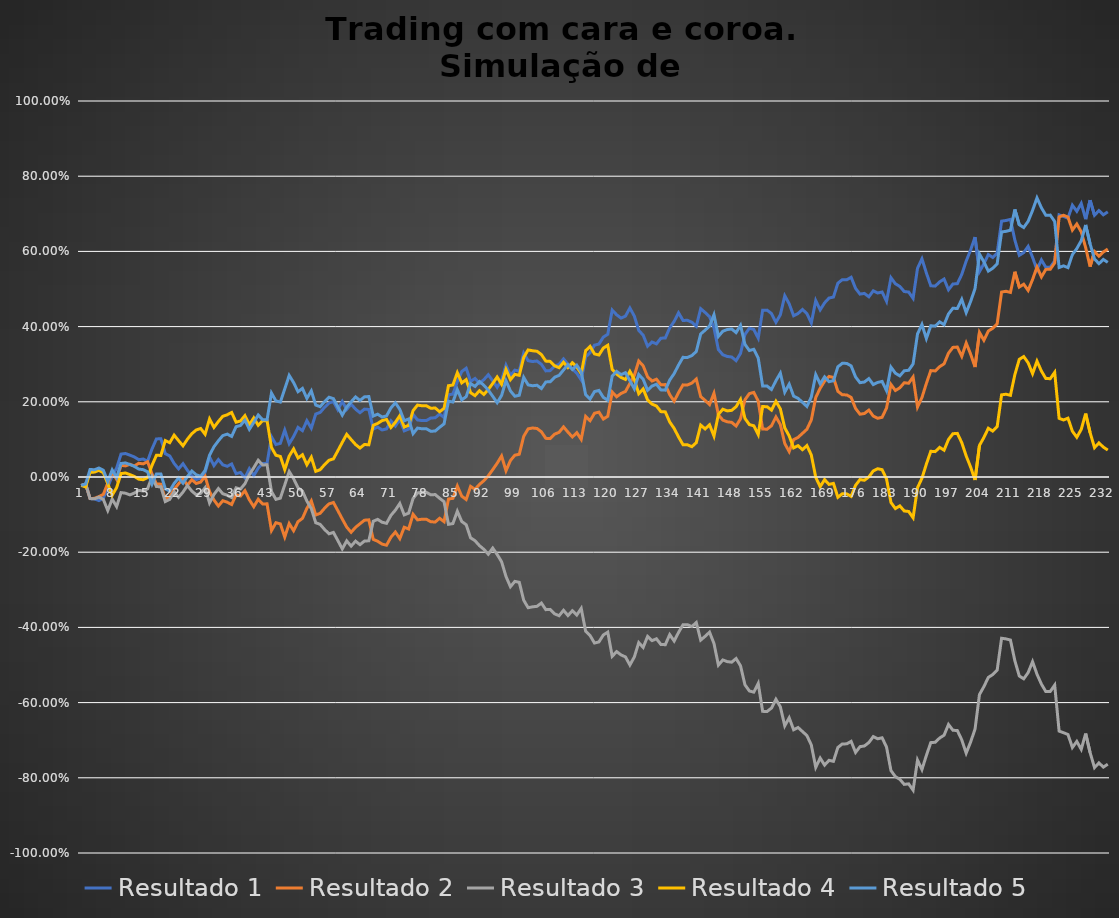
| Category | Resultado 1 | Resultado 2 | Resultado 3 | Resultado 4 | Resultado 5 |
|---|---|---|---|---|---|
| 0 | -0.022 | -0.022 | -0.022 | -0.022 | -0.022 |
| 1 | -0.019 | -0.019 | -0.019 | -0.026 | -0.019 |
| 2 | -0.057 | -0.057 | -0.057 | 0.012 | 0.02 |
| 3 | -0.058 | -0.057 | -0.058 | 0.013 | 0.019 |
| 4 | -0.063 | -0.052 | -0.053 | 0.018 | 0.024 |
| 5 | -0.057 | -0.046 | -0.059 | 0.012 | 0.018 |
| 6 | -0.027 | -0.016 | -0.089 | -0.018 | -0.012 |
| 7 | 0.003 | 0.014 | -0.059 | -0.048 | 0.019 |
| 8 | 0.024 | -0.006 | -0.079 | -0.028 | -0.001 |
| 9 | 0.061 | 0.031 | -0.041 | 0.009 | 0.036 |
| 10 | 0.063 | 0.03 | -0.043 | 0.011 | 0.038 |
| 11 | 0.058 | 0.034 | -0.047 | 0.006 | 0.033 |
| 12 | 0.053 | 0.029 | -0.043 | 0.002 | 0.028 |
| 13 | 0.046 | 0.037 | -0.035 | -0.006 | 0.021 |
| 14 | 0.048 | 0.035 | -0.037 | -0.007 | 0.019 |
| 15 | 0.042 | 0.041 | -0.031 | -0.002 | 0.014 |
| 16 | 0.075 | 0.008 | 0.001 | 0.031 | -0.019 |
| 17 | 0.101 | -0.019 | -0.025 | 0.058 | 0.008 |
| 18 | 0.102 | -0.019 | -0.026 | 0.057 | 0.008 |
| 19 | 0.062 | -0.059 | -0.065 | 0.097 | -0.031 |
| 20 | 0.056 | -0.053 | -0.06 | 0.091 | -0.037 |
| 21 | 0.036 | -0.033 | -0.039 | 0.111 | -0.017 |
| 22 | 0.022 | -0.018 | -0.054 | 0.097 | -0.003 |
| 23 | 0.035 | -0.004 | -0.04 | 0.083 | -0.016 |
| 24 | 0.018 | -0.022 | -0.023 | 0.101 | 0.001 |
| 25 | 0.003 | -0.007 | -0.037 | 0.115 | 0.016 |
| 26 | -0.007 | -0.017 | -0.047 | 0.125 | 0.006 |
| 27 | -0.003 | -0.013 | -0.044 | 0.129 | 0.002 |
| 28 | 0.012 | 0.002 | -0.028 | 0.114 | 0.017 |
| 29 | 0.053 | -0.039 | -0.069 | 0.154 | 0.058 |
| 30 | 0.03 | -0.061 | -0.046 | 0.132 | 0.08 |
| 31 | 0.046 | -0.077 | -0.031 | 0.148 | 0.096 |
| 32 | 0.032 | -0.063 | -0.045 | 0.162 | 0.11 |
| 33 | 0.028 | -0.067 | -0.048 | 0.166 | 0.114 |
| 34 | 0.035 | -0.073 | -0.055 | 0.172 | 0.108 |
| 35 | 0.009 | -0.047 | -0.029 | 0.146 | 0.134 |
| 36 | 0.012 | -0.051 | -0.032 | 0.149 | 0.137 |
| 37 | -0.002 | -0.036 | -0.018 | 0.163 | 0.151 |
| 38 | 0.022 | -0.061 | 0.007 | 0.139 | 0.127 |
| 39 | 0.004 | -0.079 | 0.025 | 0.157 | 0.145 |
| 40 | 0.023 | -0.059 | 0.045 | 0.138 | 0.165 |
| 41 | 0.036 | -0.072 | 0.032 | 0.15 | 0.153 |
| 42 | 0.036 | -0.071 | 0.032 | 0.15 | 0.152 |
| 43 | 0.107 | -0.142 | -0.039 | 0.079 | 0.223 |
| 44 | 0.086 | -0.122 | -0.059 | 0.058 | 0.202 |
| 45 | 0.09 | -0.125 | -0.056 | 0.055 | 0.199 |
| 46 | 0.124 | -0.16 | -0.021 | 0.02 | 0.234 |
| 47 | 0.089 | -0.124 | 0.015 | 0.056 | 0.27 |
| 48 | 0.108 | -0.143 | -0.004 | 0.075 | 0.251 |
| 49 | 0.132 | -0.119 | -0.029 | 0.051 | 0.227 |
| 50 | 0.123 | -0.11 | -0.037 | 0.059 | 0.236 |
| 51 | 0.15 | -0.083 | -0.064 | 0.033 | 0.209 |
| 52 | 0.13 | -0.063 | -0.084 | 0.053 | 0.229 |
| 53 | 0.167 | -0.101 | -0.122 | 0.015 | 0.191 |
| 54 | 0.172 | -0.097 | -0.126 | 0.019 | 0.187 |
| 55 | 0.185 | -0.083 | -0.14 | 0.033 | 0.201 |
| 56 | 0.197 | -0.072 | -0.151 | 0.045 | 0.212 |
| 57 | 0.201 | -0.068 | -0.147 | 0.048 | 0.208 |
| 58 | 0.179 | -0.09 | -0.169 | 0.07 | 0.187 |
| 59 | 0.201 | -0.112 | -0.191 | 0.092 | 0.165 |
| 60 | 0.18 | -0.133 | -0.17 | 0.114 | 0.186 |
| 61 | 0.194 | -0.147 | -0.184 | 0.1 | 0.2 |
| 62 | 0.18 | -0.134 | -0.171 | 0.086 | 0.213 |
| 63 | 0.171 | -0.124 | -0.18 | 0.077 | 0.204 |
| 64 | 0.181 | -0.115 | -0.17 | 0.087 | 0.213 |
| 65 | 0.18 | -0.114 | -0.17 | 0.086 | 0.214 |
| 66 | 0.128 | -0.166 | -0.118 | 0.138 | 0.162 |
| 67 | 0.133 | -0.171 | -0.113 | 0.143 | 0.167 |
| 68 | 0.125 | -0.178 | -0.12 | 0.15 | 0.16 |
| 69 | 0.128 | -0.181 | -0.123 | 0.153 | 0.162 |
| 70 | 0.149 | -0.16 | -0.102 | 0.132 | 0.184 |
| 71 | 0.135 | -0.146 | -0.088 | 0.146 | 0.198 |
| 72 | 0.153 | -0.164 | -0.07 | 0.163 | 0.18 |
| 73 | 0.123 | -0.134 | -0.101 | 0.133 | 0.15 |
| 74 | 0.128 | -0.138 | -0.096 | 0.138 | 0.154 |
| 75 | 0.166 | -0.099 | -0.057 | 0.177 | 0.115 |
| 76 | 0.152 | -0.114 | -0.042 | 0.191 | 0.13 |
| 77 | 0.15 | -0.112 | -0.041 | 0.19 | 0.128 |
| 78 | 0.15 | -0.112 | -0.041 | 0.19 | 0.128 |
| 79 | 0.157 | -0.119 | -0.047 | 0.183 | 0.122 |
| 80 | 0.158 | -0.12 | -0.047 | 0.184 | 0.122 |
| 81 | 0.167 | -0.11 | -0.057 | 0.174 | 0.132 |
| 82 | 0.158 | -0.119 | -0.066 | 0.183 | 0.141 |
| 83 | 0.219 | -0.059 | -0.126 | 0.243 | 0.201 |
| 84 | 0.221 | -0.057 | -0.124 | 0.245 | 0.2 |
| 85 | 0.253 | -0.024 | -0.091 | 0.278 | 0.232 |
| 86 | 0.28 | -0.051 | -0.118 | 0.25 | 0.205 |
| 87 | 0.289 | -0.06 | -0.127 | 0.259 | 0.214 |
| 88 | 0.254 | -0.025 | -0.162 | 0.224 | 0.249 |
| 89 | 0.262 | -0.033 | -0.169 | 0.217 | 0.241 |
| 90 | 0.249 | -0.02 | -0.182 | 0.23 | 0.254 |
| 91 | 0.259 | -0.01 | -0.192 | 0.22 | 0.244 |
| 92 | 0.272 | 0.003 | -0.205 | 0.233 | 0.231 |
| 93 | 0.256 | 0.02 | -0.189 | 0.249 | 0.215 |
| 94 | 0.239 | 0.037 | -0.206 | 0.266 | 0.198 |
| 95 | 0.258 | 0.056 | -0.225 | 0.247 | 0.217 |
| 96 | 0.297 | 0.017 | -0.265 | 0.286 | 0.256 |
| 97 | 0.27 | 0.044 | -0.292 | 0.259 | 0.229 |
| 98 | 0.284 | 0.058 | -0.278 | 0.273 | 0.215 |
| 99 | 0.282 | 0.06 | -0.28 | 0.271 | 0.217 |
| 100 | 0.329 | 0.108 | -0.328 | 0.318 | 0.265 |
| 101 | 0.309 | 0.128 | -0.348 | 0.338 | 0.245 |
| 102 | 0.307 | 0.13 | -0.345 | 0.336 | 0.243 |
| 103 | 0.308 | 0.129 | -0.344 | 0.334 | 0.244 |
| 104 | 0.3 | 0.12 | -0.335 | 0.326 | 0.235 |
| 105 | 0.282 | 0.103 | -0.353 | 0.308 | 0.253 |
| 106 | 0.283 | 0.102 | -0.352 | 0.308 | 0.254 |
| 107 | 0.295 | 0.114 | -0.364 | 0.296 | 0.265 |
| 108 | 0.3 | 0.119 | -0.369 | 0.291 | 0.27 |
| 109 | 0.314 | 0.133 | -0.355 | 0.305 | 0.285 |
| 110 | 0.3 | 0.119 | -0.369 | 0.291 | 0.299 |
| 111 | 0.287 | 0.106 | -0.356 | 0.304 | 0.286 |
| 112 | 0.276 | 0.118 | -0.367 | 0.293 | 0.297 |
| 113 | 0.258 | 0.1 | -0.349 | 0.275 | 0.28 |
| 114 | 0.319 | 0.161 | -0.41 | 0.336 | 0.219 |
| 115 | 0.331 | 0.15 | -0.422 | 0.347 | 0.207 |
| 116 | 0.351 | 0.17 | -0.442 | 0.327 | 0.227 |
| 117 | 0.354 | 0.173 | -0.439 | 0.324 | 0.23 |
| 118 | 0.372 | 0.154 | -0.42 | 0.343 | 0.212 |
| 119 | 0.38 | 0.162 | -0.413 | 0.35 | 0.204 |
| 120 | 0.444 | 0.226 | -0.477 | 0.286 | 0.269 |
| 121 | 0.431 | 0.213 | -0.464 | 0.274 | 0.281 |
| 122 | 0.423 | 0.222 | -0.473 | 0.265 | 0.272 |
| 123 | 0.428 | 0.227 | -0.479 | 0.26 | 0.278 |
| 124 | 0.449 | 0.249 | -0.5 | 0.281 | 0.256 |
| 125 | 0.428 | 0.27 | -0.479 | 0.26 | 0.235 |
| 126 | 0.39 | 0.308 | -0.441 | 0.222 | 0.273 |
| 127 | 0.377 | 0.296 | -0.453 | 0.234 | 0.26 |
| 128 | 0.348 | 0.266 | -0.424 | 0.205 | 0.231 |
| 129 | 0.359 | 0.255 | -0.435 | 0.194 | 0.242 |
| 130 | 0.354 | 0.26 | -0.43 | 0.189 | 0.247 |
| 131 | 0.369 | 0.245 | -0.445 | 0.174 | 0.232 |
| 132 | 0.37 | 0.246 | -0.446 | 0.173 | 0.231 |
| 133 | 0.397 | 0.219 | -0.419 | 0.146 | 0.258 |
| 134 | 0.414 | 0.202 | -0.436 | 0.129 | 0.275 |
| 135 | 0.437 | 0.225 | -0.413 | 0.106 | 0.298 |
| 136 | 0.416 | 0.245 | -0.393 | 0.086 | 0.318 |
| 137 | 0.417 | 0.245 | -0.393 | 0.086 | 0.318 |
| 138 | 0.412 | 0.25 | -0.398 | 0.081 | 0.323 |
| 139 | 0.401 | 0.261 | -0.387 | 0.091 | 0.334 |
| 140 | 0.448 | 0.214 | -0.434 | 0.138 | 0.38 |
| 141 | 0.438 | 0.204 | -0.424 | 0.128 | 0.391 |
| 142 | 0.427 | 0.193 | -0.413 | 0.139 | 0.402 |
| 143 | 0.397 | 0.223 | -0.443 | 0.109 | 0.432 |
| 144 | 0.339 | 0.165 | -0.5 | 0.167 | 0.374 |
| 145 | 0.325 | 0.151 | -0.487 | 0.18 | 0.388 |
| 146 | 0.321 | 0.147 | -0.491 | 0.176 | 0.392 |
| 147 | 0.319 | 0.145 | -0.493 | 0.177 | 0.394 |
| 148 | 0.309 | 0.136 | -0.483 | 0.187 | 0.384 |
| 149 | 0.329 | 0.155 | -0.502 | 0.206 | 0.403 |
| 150 | 0.379 | 0.205 | -0.553 | 0.156 | 0.353 |
| 151 | 0.396 | 0.222 | -0.569 | 0.139 | 0.336 |
| 152 | 0.392 | 0.225 | -0.572 | 0.136 | 0.34 |
| 153 | 0.369 | 0.202 | -0.549 | 0.113 | 0.316 |
| 154 | 0.444 | 0.128 | -0.623 | 0.187 | 0.242 |
| 155 | 0.444 | 0.127 | -0.624 | 0.187 | 0.242 |
| 156 | 0.435 | 0.136 | -0.614 | 0.178 | 0.233 |
| 157 | 0.411 | 0.16 | -0.591 | 0.201 | 0.256 |
| 158 | 0.431 | 0.14 | -0.611 | 0.181 | 0.276 |
| 159 | 0.482 | 0.089 | -0.662 | 0.131 | 0.226 |
| 160 | 0.461 | 0.068 | -0.64 | 0.109 | 0.247 |
| 161 | 0.429 | 0.099 | -0.672 | 0.077 | 0.215 |
| 162 | 0.435 | 0.105 | -0.666 | 0.083 | 0.209 |
| 163 | 0.446 | 0.116 | -0.677 | 0.073 | 0.199 |
| 164 | 0.435 | 0.127 | -0.688 | 0.084 | 0.188 |
| 165 | 0.41 | 0.152 | -0.713 | 0.059 | 0.213 |
| 166 | 0.469 | 0.211 | -0.772 | -0.001 | 0.272 |
| 167 | 0.445 | 0.236 | -0.748 | -0.026 | 0.248 |
| 168 | 0.463 | 0.255 | -0.766 | -0.007 | 0.266 |
| 169 | 0.476 | 0.268 | -0.754 | -0.02 | 0.254 |
| 170 | 0.479 | 0.265 | -0.756 | -0.017 | 0.256 |
| 171 | 0.516 | 0.228 | -0.719 | -0.054 | 0.293 |
| 172 | 0.525 | 0.219 | -0.71 | -0.045 | 0.302 |
| 173 | 0.525 | 0.218 | -0.71 | -0.045 | 0.302 |
| 174 | 0.531 | 0.212 | -0.703 | -0.051 | 0.296 |
| 175 | 0.502 | 0.182 | -0.733 | -0.022 | 0.266 |
| 176 | 0.486 | 0.167 | -0.717 | -0.007 | 0.251 |
| 177 | 0.488 | 0.169 | -0.715 | -0.009 | 0.253 |
| 178 | 0.479 | 0.178 | -0.706 | 0 | 0.262 |
| 179 | 0.495 | 0.162 | -0.69 | 0.016 | 0.246 |
| 180 | 0.489 | 0.156 | -0.696 | 0.022 | 0.252 |
| 181 | 0.492 | 0.159 | -0.694 | 0.019 | 0.254 |
| 182 | 0.467 | 0.184 | -0.718 | -0.005 | 0.23 |
| 183 | 0.53 | 0.246 | -0.781 | -0.068 | 0.292 |
| 184 | 0.514 | 0.23 | -0.797 | -0.084 | 0.276 |
| 185 | 0.507 | 0.237 | -0.804 | -0.077 | 0.269 |
| 186 | 0.493 | 0.251 | -0.818 | -0.09 | 0.283 |
| 187 | 0.492 | 0.249 | -0.816 | -0.092 | 0.284 |
| 188 | 0.475 | 0.266 | -0.833 | -0.108 | 0.301 |
| 189 | 0.555 | 0.186 | -0.753 | -0.028 | 0.381 |
| 190 | 0.58 | 0.211 | -0.778 | -0.003 | 0.406 |
| 191 | 0.543 | 0.249 | -0.741 | 0.034 | 0.368 |
| 192 | 0.509 | 0.283 | -0.706 | 0.068 | 0.402 |
| 193 | 0.508 | 0.282 | -0.706 | 0.068 | 0.401 |
| 194 | 0.519 | 0.293 | -0.694 | 0.079 | 0.413 |
| 195 | 0.527 | 0.301 | -0.687 | 0.071 | 0.405 |
| 196 | 0.498 | 0.329 | -0.658 | 0.1 | 0.434 |
| 197 | 0.513 | 0.345 | -0.674 | 0.115 | 0.449 |
| 198 | 0.514 | 0.346 | -0.674 | 0.116 | 0.448 |
| 199 | 0.539 | 0.321 | -0.699 | 0.091 | 0.473 |
| 200 | 0.574 | 0.356 | -0.734 | 0.056 | 0.437 |
| 201 | 0.604 | 0.327 | -0.705 | 0.026 | 0.467 |
| 202 | 0.638 | 0.293 | -0.671 | -0.008 | 0.501 |
| 203 | 0.546 | 0.385 | -0.579 | 0.084 | 0.593 |
| 204 | 0.567 | 0.364 | -0.558 | 0.105 | 0.572 |
| 205 | 0.592 | 0.388 | -0.533 | 0.13 | 0.548 |
| 206 | 0.584 | 0.396 | -0.525 | 0.122 | 0.555 |
| 207 | 0.596 | 0.407 | -0.514 | 0.134 | 0.567 |
| 208 | 0.681 | 0.492 | -0.429 | 0.219 | 0.652 |
| 209 | 0.682 | 0.494 | -0.431 | 0.22 | 0.653 |
| 210 | 0.685 | 0.491 | -0.434 | 0.217 | 0.656 |
| 211 | 0.63 | 0.546 | -0.489 | 0.272 | 0.712 |
| 212 | 0.59 | 0.505 | -0.529 | 0.313 | 0.671 |
| 213 | 0.597 | 0.513 | -0.537 | 0.32 | 0.664 |
| 214 | 0.613 | 0.496 | -0.52 | 0.304 | 0.68 |
| 215 | 0.584 | 0.525 | -0.491 | 0.275 | 0.709 |
| 216 | 0.551 | 0.558 | -0.525 | 0.308 | 0.742 |
| 217 | 0.577 | 0.532 | -0.551 | 0.282 | 0.716 |
| 218 | 0.558 | 0.552 | -0.571 | 0.262 | 0.696 |
| 219 | 0.558 | 0.552 | -0.57 | 0.262 | 0.697 |
| 220 | 0.575 | 0.569 | -0.553 | 0.278 | 0.68 |
| 221 | 0.697 | 0.692 | -0.676 | 0.156 | 0.557 |
| 222 | 0.693 | 0.696 | -0.68 | 0.152 | 0.562 |
| 223 | 0.688 | 0.691 | -0.685 | 0.156 | 0.557 |
| 224 | 0.723 | 0.657 | -0.719 | 0.122 | 0.591 |
| 225 | 0.707 | 0.673 | -0.703 | 0.106 | 0.608 |
| 226 | 0.728 | 0.652 | -0.724 | 0.127 | 0.629 |
| 227 | 0.686 | 0.61 | -0.682 | 0.169 | 0.67 |
| 228 | 0.736 | 0.56 | -0.733 | 0.118 | 0.62 |
| 229 | 0.696 | 0.6 | -0.773 | 0.078 | 0.58 |
| 230 | 0.709 | 0.587 | -0.76 | 0.091 | 0.567 |
| 231 | 0.697 | 0.598 | -0.772 | 0.079 | 0.579 |
| 232 | 0.705 | 0.606 | -0.764 | 0.072 | 0.571 |